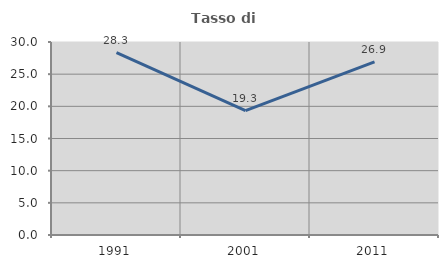
| Category | Tasso di occupazione   |
|---|---|
| 1991.0 | 28.345 |
| 2001.0 | 19.326 |
| 2011.0 | 26.911 |